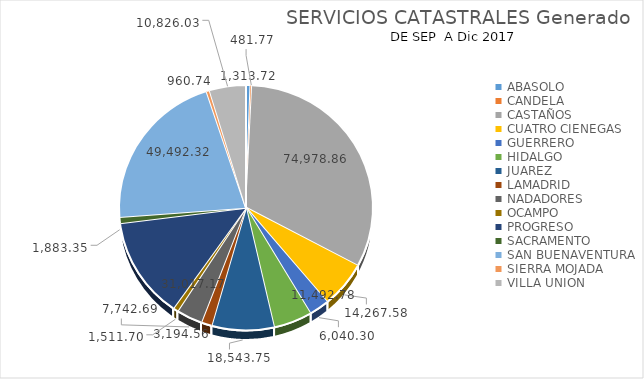
| Category | Series 0 |
|---|---|
| ABASOLO | 1313.72 |
| CANDELA | 481.77 |
| CASTAÑOS | 74978.86 |
| CUATRO CIENEGAS | 14267.58 |
| GUERRERO | 6040.3 |
| HIDALGO | 11492.78 |
| JUAREZ | 18543.75 |
| LAMADRID | 3194.56 |
| NADADORES | 7742.69 |
| OCAMPO | 1511.7 |
| PROGRESO | 31017.17 |
| SACRAMENTO | 1883.35 |
| SAN BUENAVENTURA | 49492.32 |
| SIERRA MOJADA | 960.74 |
| VILLA UNION | 10826.03 |